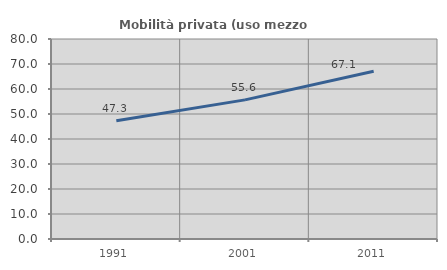
| Category | Mobilità privata (uso mezzo privato) |
|---|---|
| 1991.0 | 47.312 |
| 2001.0 | 55.643 |
| 2011.0 | 67.127 |